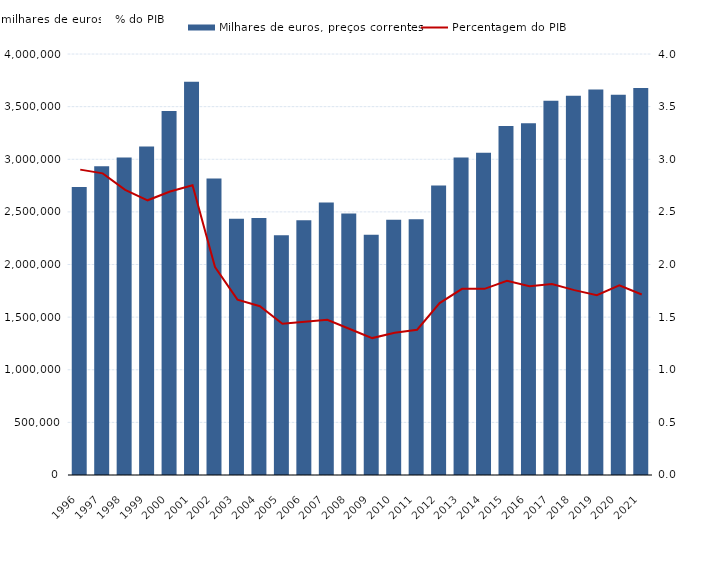
| Category | Milhares de euros, preços correntes |
|---|---|
| 1996.0 | 2737490 |
| 1997.0 | 2932550 |
| 1998.0 | 3016290 |
| 1999.0 | 3121680 |
| 2000.0 | 3458120 |
| 2001.0 | 3736820 |
| 2002.0 | 2817880 |
| 2003.0 | 2433780 |
| 2004.0 | 2442160 |
| 2005.0 | 2277250 |
| 2006.0 | 2420270 |
| 2007.0 | 2588420 |
| 2008.0 | 2484680 |
| 2009.0 | 2281870 |
| 2010.0 | 2425900 |
| 2011.0 | 2430490 |
| 2012.0 | 2749460 |
| 2013.0 | 3015780 |
| 2014.0 | 3060710 |
| 2015.0 | 3315620 |
| 2016.0 | 3343200 |
| 2017.0 | 3554750 |
| 2018.0 | 3604010 |
| 2019.0 | 3662130 |
| 2020.0 | 3612860 |
| 2021.0 | 3677760 |